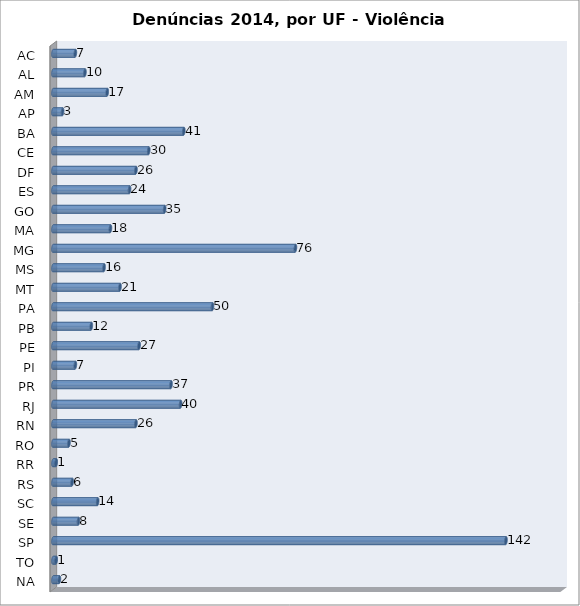
| Category | Series 0 |
|---|---|
| AC | 7 |
| AL | 10 |
| AM | 17 |
| AP | 3 |
| BA | 41 |
| CE | 30 |
| DF | 26 |
| ES | 24 |
| GO | 35 |
| MA | 18 |
| MG | 76 |
| MS | 16 |
| MT | 21 |
| PA | 50 |
| PB | 12 |
| PE | 27 |
| PI | 7 |
| PR | 37 |
| RJ | 40 |
| RN | 26 |
| RO | 5 |
| RR | 1 |
| RS | 6 |
| SC | 14 |
| SE | 8 |
| SP | 142 |
| TO | 1 |
| NA | 2 |